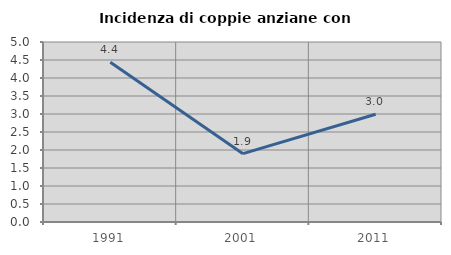
| Category | Incidenza di coppie anziane con figli |
|---|---|
| 1991.0 | 4.437 |
| 2001.0 | 1.899 |
| 2011.0 | 2.994 |